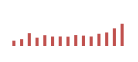
| Category | Importações (2) |
|---|---|
| 0 | 575.605 |
| 1 | 741.035 |
| 2 | 1388.881 |
| 3 | 899.436 |
| 4 | 1170.349 |
| 5 | 1022.737 |
| 6 | 1030.066 |
| 7 | 1010.02 |
| 8 | 1183.202 |
| 9 | 1121.55 |
| 10 | 1027.2 |
| 11 | 1322.664 |
| 12 | 1463.875 |
| 13 | 1908.09 |
| 14 | 2403.679 |